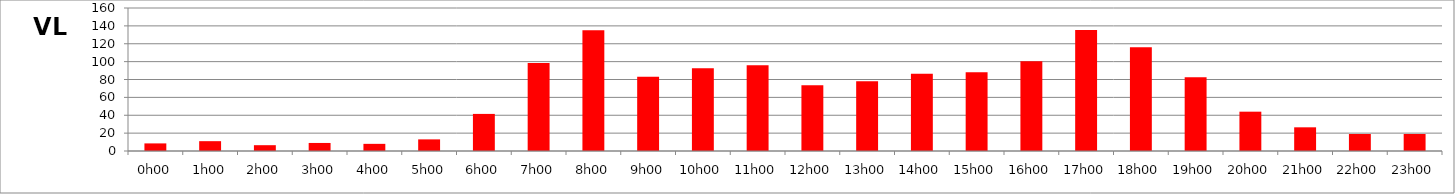
| Category | VL |
|---|---|
| 0.0 | 8.5 |
| 0.041666666666666664 | 11 |
| 0.08333333333333333 | 6.5 |
| 0.125 | 9 |
| 0.16666666666666666 | 8 |
| 0.20833333333333334 | 13 |
| 0.25 | 41.5 |
| 0.2916666666666667 | 98.5 |
| 0.3333333333333333 | 135 |
| 0.375 | 83 |
| 0.4166666666666667 | 92.5 |
| 0.4583333333333333 | 96 |
| 0.5 | 73.5 |
| 0.5416666666666666 | 78 |
| 0.5833333333333334 | 86.5 |
| 0.625 | 88 |
| 0.6666666666666666 | 100.5 |
| 0.7083333333333334 | 135.5 |
| 0.75 | 116 |
| 0.7916666666666666 | 82.5 |
| 0.8333333333333334 | 44 |
| 0.875 | 26.5 |
| 0.9166666666666666 | 19 |
| 0.9583333333333334 | 19 |